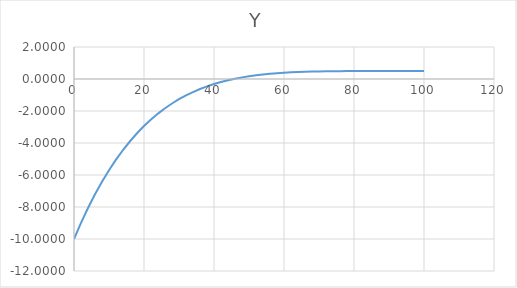
| Category | Y |
|---|---|
| 100.0 | 0.5 |
| 98.0 | 0.5 |
| 96.0 | 0.5 |
| 94.0 | 0.5 |
| 92.0 | 0.5 |
| 90.0 | 0.5 |
| 88.0 | 0.5 |
| 86.0 | 0.499 |
| 84.0 | 0.499 |
| 82.0 | 0.498 |
| 80.0 | 0.497 |
| 78.0 | 0.495 |
| 76.0 | 0.492 |
| 74.0 | 0.488 |
| 72.0 | 0.482 |
| 70.0 | 0.474 |
| 68.0 | 0.465 |
| 66.0 | 0.452 |
| 64.0 | 0.437 |
| 62.0 | 0.417 |
| 60.0 | 0.392 |
| 58.0 | 0.363 |
| 56.0 | 0.327 |
| 54.0 | 0.284 |
| 52.0 | 0.232 |
| 50.0 | 0.172 |
| 48.0 | 0.101 |
| 46.0 | 0.018 |
| 44.0 | -0.078 |
| 42.0 | -0.189 |
| 40.0 | -0.316 |
| 38.0 | -0.462 |
| 36.0 | -0.627 |
| 34.0 | -0.815 |
| 32.0 | -1.027 |
| 30.0 | -1.265 |
| 28.0 | -1.532 |
| 26.0 | -1.83 |
| 24.0 | -2.162 |
| 22.0 | -2.532 |
| 20.0 | -2.941 |
| 18.0 | -3.393 |
| 16.0 | -3.891 |
| 14.0 | -4.439 |
| 12.0 | -5.041 |
| 10.0 | -5.7 |
| 8.0 | -6.42 |
| 6.0 | -7.206 |
| 4.0 | -8.061 |
| 2.0 | -8.991 |
| 0.0 | -10 |